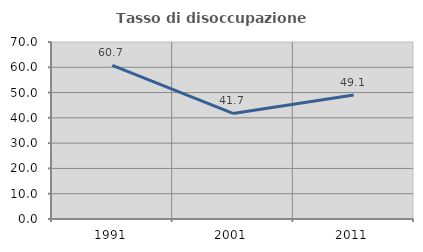
| Category | Tasso di disoccupazione giovanile  |
|---|---|
| 1991.0 | 60.736 |
| 2001.0 | 41.748 |
| 2011.0 | 49.057 |